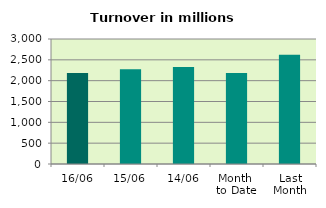
| Category | Series 0 |
|---|---|
| 16/06 | 2183.078 |
| 15/06 | 2276.827 |
| 14/06 | 2328.394 |
| Month 
to Date | 2185.656 |
| Last
Month | 2619.784 |